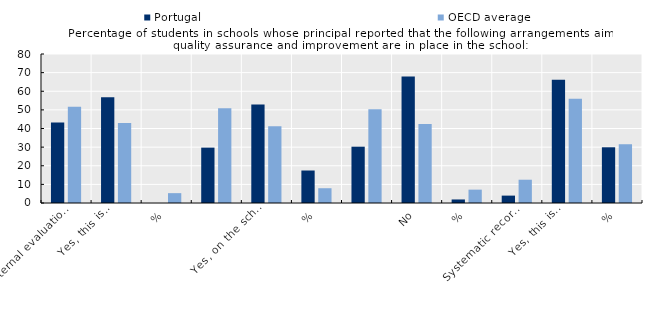
| Category | Portugal | OECD average |
|---|---|---|
| 0 | 43.278 | 51.71 |
| 1 | 56.722 | 43.002 |
| 2 | 0 | 5.288 |
| 3 | 29.731 | 50.914 |
| 4 | 52.824 | 41.153 |
| 5 | 17.445 | 7.932 |
| 6 | 30.238 | 50.373 |
| 7 | 67.864 | 42.457 |
| 8 | 1.899 | 7.17 |
| 9 | 3.965 | 12.499 |
| 10 | 66.12 | 55.951 |
| 11 | 29.915 | 31.55 |